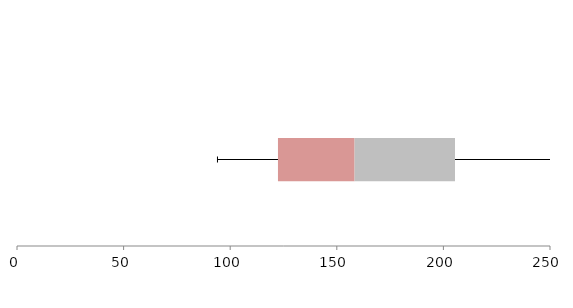
| Category | Series 1 | Series 2 | Series 3 |
|---|---|---|---|
| 0 | 122.407 | 35.938 | 47.097 |